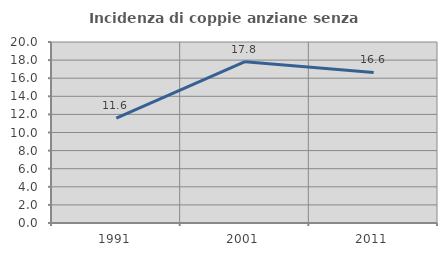
| Category | Incidenza di coppie anziane senza figli  |
|---|---|
| 1991.0 | 11.592 |
| 2001.0 | 17.83 |
| 2011.0 | 16.638 |